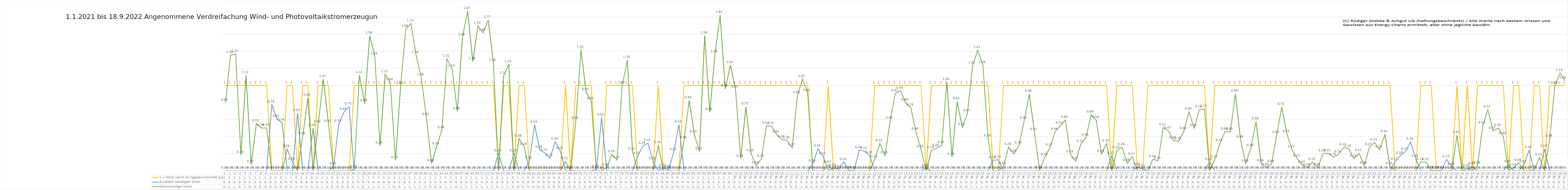
| Category | 1 = Strom reicht im Tagesdurchschnitt aus | Zusätzlich benötigter Strom | Überschüssiger Strom |
|---|---|---|---|
| 0 | 1 | 0 | 0.798 |
| 1 | 1 | 0 | 1.356 |
| 2 | 1 | 0 | 1.366 |
| 3 | 1 | 0 | 0.184 |
| 4 | 1 | 0 | 1.118 |
| 5 | 1 | 0 | 0.073 |
| 6 | 1 | 0 | 0.553 |
| 7 | 1 | 0 | 0.501 |
| 8 | 1 | 0 | 0.503 |
| 9 | 0 | 0.777 | 0 |
| 10 | 0 | 0.606 | 0 |
| 11 | 0 | 0.563 | 0 |
| 12 | 1 | 0 | 0.255 |
| 13 | 1 | 0 | 0.104 |
| 14 | 0 | 0.673 | 0 |
| 15 | 1 | 0 | 0.405 |
| 16 | 1 | 0 | 0.852 |
| 17 | 0 | 0.502 | 0 |
| 18 | 1 | 0 | 0.54 |
| 19 | 1 | 0 | 1.074 |
| 20 | 1 | 0 | 0.546 |
| 21 | 0 | 0.048 | 0 |
| 22 | 0 | 0.55 | 0 |
| 23 | 0 | 0.688 | 0 |
| 24 | 0 | 0.751 | 0 |
| 25 | 1 | 0 | 0.018 |
| 26 | 1 | 0 | 1.121 |
| 27 | 1 | 0 | 0.788 |
| 28 | 1 | 0 | 1.583 |
| 29 | 1 | 0 | 1.338 |
| 30 | 1 | 0 | 0.293 |
| 31 | 1 | 0 | 1.13 |
| 32 | 1 | 0 | 1.037 |
| 33 | 1 | 0 | 0.123 |
| 34 | 1 | 0 | 0.992 |
| 35 | 1 | 0 | 1.662 |
| 36 | 1 | 0 | 1.724 |
| 37 | 1 | 0 | 1.355 |
| 38 | 1 | 0 | 1.094 |
| 39 | 1 | 0 | 0.628 |
| 40 | 1 | 0 | 0.085 |
| 41 | 1 | 0 | 0.286 |
| 42 | 1 | 0 | 0.476 |
| 43 | 1 | 0 | 1.311 |
| 44 | 1 | 0 | 1.194 |
| 45 | 1 | 0 | 0.694 |
| 46 | 1 | 0 | 1.563 |
| 47 | 1 | 0 | 1.87 |
| 48 | 1 | 0 | 1.28 |
| 49 | 1 | 0 | 1.697 |
| 50 | 1 | 0 | 1.616 |
| 51 | 1 | 0 | 1.767 |
| 52 | 1 | 0 | 1.264 |
| 53 | 0 | 0.202 | 0 |
| 54 | 1 | 0 | 1.112 |
| 55 | 1 | 0 | 1.247 |
| 56 | 0 | 0.202 | 0 |
| 57 | 1 | 0 | 0.376 |
| 58 | 1 | 0 | 0.278 |
| 59 | 0 | 0.118 | 0 |
| 60 | 0 | 0.538 | 0 |
| 61 | 0 | 0.244 | 0 |
| 62 | 0 | 0.209 | 0 |
| 63 | 0 | 0.147 | 0 |
| 64 | 0 | 0.341 | 0 |
| 65 | 0 | 0.231 | 0 |
| 66 | 1 | 0 | 0.11 |
| 67 | 0 | 0.003 | 0 |
| 68 | 1 | 0 | 0.584 |
| 69 | 1 | 0 | 1.417 |
| 70 | 1 | 0 | 0.92 |
| 71 | 1 | 0 | 0.813 |
| 72 | 0 | 0.019 | 0 |
| 73 | 0 | 0.624 | 0 |
| 74 | 1 | 0 | 0.038 |
| 75 | 1 | 0 | 0.193 |
| 76 | 1 | 0 | 0.125 |
| 77 | 1 | 0 | 0.999 |
| 78 | 1 | 0 | 1.297 |
| 79 | 1 | 0 | 0.224 |
| 80 | 0 | 0.171 | 0 |
| 81 | 0 | 0.289 | 0 |
| 82 | 0 | 0.323 | 0 |
| 83 | 0 | 0.11 | 0 |
| 84 | 1 | 0 | 0.298 |
| 85 | 0 | 0.032 | 0 |
| 86 | 0 | 0.013 | 0 |
| 87 | 0 | 0.22 | 0 |
| 88 | 0 | 0.541 | 0 |
| 89 | 1 | 0 | 0.357 |
| 90 | 1 | 0 | 0.825 |
| 91 | 1 | 0 | 0.425 |
| 92 | 1 | 0 | 0.225 |
| 93 | 1 | 0 | 1.583 |
| 94 | 1 | 0 | 0.686 |
| 95 | 1 | 0 | 1.361 |
| 96 | 1 | 0 | 1.824 |
| 97 | 1 | 0 | 0.96 |
| 98 | 1 | 0 | 1.239 |
| 99 | 1 | 0 | 0.951 |
| 100 | 1 | 0 | 0.14 |
| 101 | 1 | 0 | 0.751 |
| 102 | 1 | 0 | 0.205 |
| 103 | 1 | 0 | 0.06 |
| 104 | 1 | 0 | 0.138 |
| 105 | 1 | 0 | 0.525 |
| 106 | 1 | 0 | 0.524 |
| 107 | 1 | 0 | 0.425 |
| 108 | 1 | 0 | 0.366 |
| 109 | 1 | 0 | 0.357 |
| 110 | 1 | 0 | 0.269 |
| 111 | 1 | 0 | 0.884 |
| 112 | 1 | 0 | 1.074 |
| 113 | 1 | 0 | 0.908 |
| 114 | 0 | 0.082 | 0 |
| 115 | 0 | 0.258 | 0 |
| 116 | 0 | 0.168 | 0 |
| 117 | 1 | 0 | 0.068 |
| 118 | 0 | 0.031 | 0 |
| 119 | 0 | 0.016 | 0 |
| 120 | 0 | 0.104 | 0 |
| 121 | 0 | 0.005 | 0 |
| 122 | 0 | 0.003 | 0 |
| 123 | 0 | 0.242 | 0 |
| 124 | 0 | 0.23 | 0 |
| 125 | 0 | 0.181 | 0 |
| 126 | 1 | 0 | 0.134 |
| 127 | 1 | 0 | 0.321 |
| 128 | 1 | 0 | 0.178 |
| 129 | 1 | 0 | 0.585 |
| 130 | 1 | 0 | 0.906 |
| 131 | 1 | 0 | 0.937 |
| 132 | 1 | 0 | 0.798 |
| 133 | 1 | 0 | 0.741 |
| 134 | 1 | 0 | 0.458 |
| 135 | 1 | 0 | 0.25 |
| 136 | 0 | 0.03 | 0 |
| 137 | 1 | 0 | 0.238 |
| 138 | 1 | 0 | 0.263 |
| 139 | 1 | 0 | 0.298 |
| 140 | 1 | 0 | 1.04 |
| 141 | 1 | 0 | 0.161 |
| 142 | 1 | 0 | 0.812 |
| 143 | 1 | 0 | 0.509 |
| 144 | 1 | 0 | 0.672 |
| 145 | 1 | 0 | 1.232 |
| 146 | 1 | 0 | 1.413 |
| 147 | 1 | 0 | 1.238 |
| 148 | 1 | 0 | 0.379 |
| 149 | 0 | 0.123 | 0 |
| 150 | 0 | 0.129 | 0 |
| 151 | 1 | 0 | 0.052 |
| 152 | 1 | 0 | 0.279 |
| 153 | 1 | 0 | 0.199 |
| 154 | 1 | 0 | 0.296 |
| 155 | 1 | 0 | 0.585 |
| 156 | 1 | 0 | 0.899 |
| 157 | 1 | 0 | 0.452 |
| 158 | 1 | 0 | 0.009 |
| 159 | 1 | 0 | 0.156 |
| 160 | 1 | 0 | 0.272 |
| 161 | 1 | 0 | 0.456 |
| 162 | 1 | 0 | 0.528 |
| 163 | 1 | 0 | 0.595 |
| 164 | 1 | 0 | 0.191 |
| 165 | 1 | 0 | 0.114 |
| 166 | 1 | 0 | 0.312 |
| 167 | 1 | 0 | 0.386 |
| 168 | 1 | 0 | 0.659 |
| 169 | 1 | 0 | 0.592 |
| 170 | 1 | 0 | 0.196 |
| 171 | 1 | 0 | 0.32 |
| 172 | 0 | 0.174 | 0 |
| 173 | 1 | 0 | 0.24 |
| 174 | 1 | 0 | 0.276 |
| 175 | 1 | 0 | 0.09 |
| 176 | 1 | 0 | 0.165 |
| 177 | 0 | 0.041 | 0 |
| 178 | 0 | 0.023 | 0 |
| 179 | 1 | 0 | 0 |
| 180 | 1 | 0 | 0.136 |
| 181 | 1 | 0 | 0.116 |
| 182 | 1 | 0 | 0.505 |
| 183 | 1 | 0 | 0.468 |
| 184 | 1 | 0 | 0.354 |
| 185 | 1 | 0 | 0.345 |
| 186 | 1 | 0 | 0.464 |
| 187 | 1 | 0 | 0.69 |
| 188 | 1 | 0 | 0.498 |
| 189 | 1 | 0 | 0.717 |
| 190 | 1 | 0 | 0.723 |
| 191 | 0 | 0.104 | 0 |
| 192 | 1 | 0 | 0.132 |
| 193 | 1 | 0 | 0.323 |
| 194 | 1 | 0 | 0.459 |
| 195 | 1 | 0 | 0.454 |
| 196 | 1 | 0 | 0.901 |
| 197 | 1 | 0 | 0.364 |
| 198 | 1 | 0 | 0.084 |
| 199 | 1 | 0 | 0.264 |
| 200 | 1 | 0 | 0.577 |
| 201 | 1 | 0 | 0.085 |
| 202 | 1 | 0 | 0.039 |
| 203 | 1 | 0 | 0.077 |
| 204 | 1 | 0 | 0.418 |
| 205 | 1 | 0 | 0.746 |
| 206 | 1 | 0 | 0.431 |
| 207 | 1 | 0 | 0.247 |
| 208 | 1 | 0 | 0.142 |
| 209 | 1 | 0 | 0.068 |
| 210 | 1 | 0 | 0.037 |
| 211 | 1 | 0 | 0.102 |
| 212 | 1 | 0 | 0.038 |
| 213 | 1 | 0 | 0.202 |
| 214 | 1 | 0 | 0.206 |
| 215 | 1 | 0 | 0.16 |
| 216 | 1 | 0 | 0.19 |
| 217 | 1 | 0 | 0.274 |
| 218 | 1 | 0 | 0.26 |
| 219 | 1 | 0 | 0.14 |
| 220 | 1 | 0 | 0.206 |
| 221 | 1 | 0 | 0.061 |
| 222 | 1 | 0 | 0.275 |
| 223 | 1 | 0 | 0.331 |
| 224 | 1 | 0 | 0.247 |
| 225 | 1 | 0 | 0.427 |
| 226 | 1 | 0 | 0.051 |
| 227 | 0 | 0.105 | 0 |
| 228 | 0 | 0.177 | 0 |
| 229 | 0 | 0.223 | 0 |
| 230 | 0 | 0.339 | 0 |
| 231 | 0 | 0.139 | 0 |
| 232 | 1 | 0 | 0.105 |
| 233 | 1 | 0 | 0.1 |
| 234 | 1 | 0 | 0.009 |
| 235 | 0 | 0.004 | 0 |
| 236 | 0 | 0.007 | 0 |
| 237 | 0 | 0.133 | 0 |
| 238 | 0 | 0.044 | 0 |
| 239 | 1 | 0 | 0.418 |
| 240 | 0 | 0.001 | 0 |
| 241 | 1 | 0 | 0.028 |
| 242 | 0 | 0.05 | 0 |
| 243 | 1 | 0 | 0.059 |
| 244 | 1 | 0 | 0.528 |
| 245 | 1 | 0 | 0.716 |
| 246 | 1 | 0 | 0.467 |
| 247 | 1 | 0 | 0.5 |
| 248 | 1 | 0 | 0.404 |
| 249 | 0 | 0.074 | 0 |
| 250 | 1 | 0 | 0.037 |
| 251 | 1 | 0 | 0.092 |
| 252 | 0 | 0.073 | 0 |
| 253 | 0 | 0.24 | 0 |
| 254 | 1 | 0 | 0.014 |
| 255 | 1 | 0 | 0.154 |
| 256 | 0 | 0.255 | 0 |
| 257 | 1 | 0 | 0.376 |
| 258 | 1 | 0 | 0.994 |
| 259 | 1 | 0 | 1.143 |
| 260 | 1 | 0 | 1.055 |